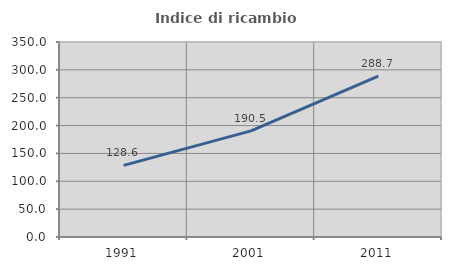
| Category | Indice di ricambio occupazionale  |
|---|---|
| 1991.0 | 128.571 |
| 2001.0 | 190.476 |
| 2011.0 | 288.71 |